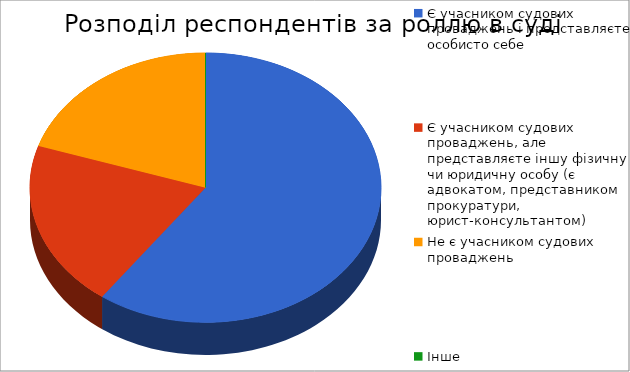
| Category | Series 0 |
|---|---|
| Є учасником судових проваджень і представляєте особисто себе | 30 |
| Є учасником судових проваджень, але представляєте іншу фізичну чи юридичну особу (є адвокатом, представником прокуратури, юрист-консультантом) | 10 |
| Не є учасником судових проваджень | 10 |
| Інше | 0 |